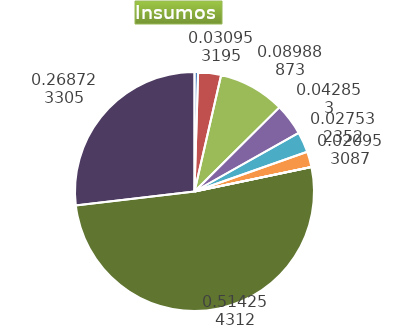
| Category | Series 0 |
|---|---|
| Control arvenses | 105736 |
| Control fitosanitario | 675930 |
| Cosecha y beneficio | 1962914.974 |
| Fertilización | 935788 |
| Instalación | 601228.503 |
| Otros | 457556 |
| Podas | 0 |
| Riego | 0 |
| Transporte | 11229856 |
| Tutorado | 5868155 |